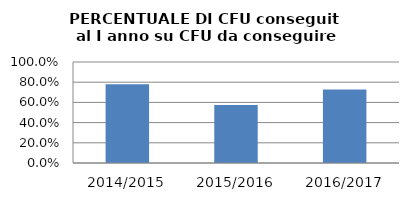
| Category | 2014/2015 2015/2016 2016/2017 |
|---|---|
| 2014/2015 | 0.781 |
| 2015/2016 | 0.574 |
| 2016/2017 | 0.729 |